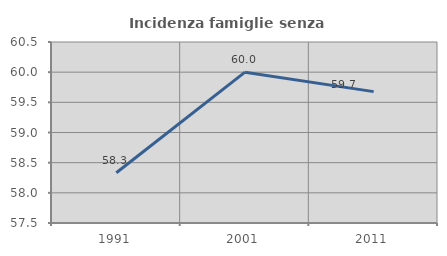
| Category | Incidenza famiglie senza nuclei |
|---|---|
| 1991.0 | 58.333 |
| 2001.0 | 60 |
| 2011.0 | 59.677 |